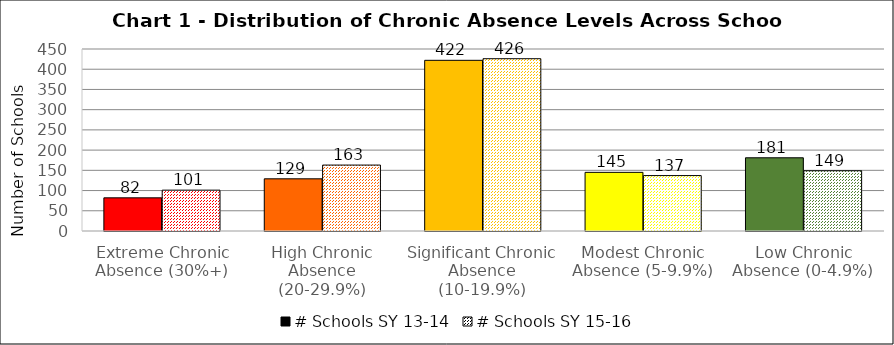
| Category | # Schools SY 13-14 | # Schools SY 15-16 |
|---|---|---|
| Extreme Chronic Absence (30%+) | 82 | 101 |
| High Chronic Absence (20-29.9%) | 129 | 163 |
| Significant Chronic Absence (10-19.9%) | 422 | 426 |
| Modest Chronic Absence (5-9.9%) | 145 | 137 |
| Low Chronic Absence (0-4.9%) | 181 | 149 |